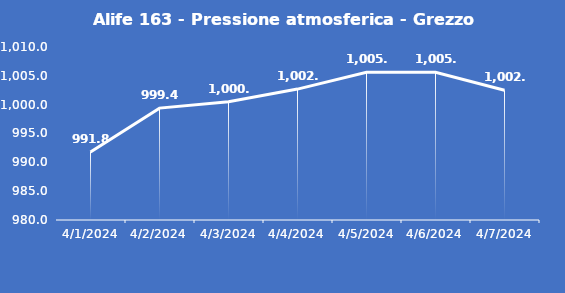
| Category | Alife 163 - Pressione atmosferica - Grezzo (hPa) |
|---|---|
| 4/1/24 | 991.8 |
| 4/2/24 | 999.4 |
| 4/3/24 | 1000.5 |
| 4/4/24 | 1002.7 |
| 4/5/24 | 1005.6 |
| 4/6/24 | 1005.6 |
| 4/7/24 | 1002.5 |